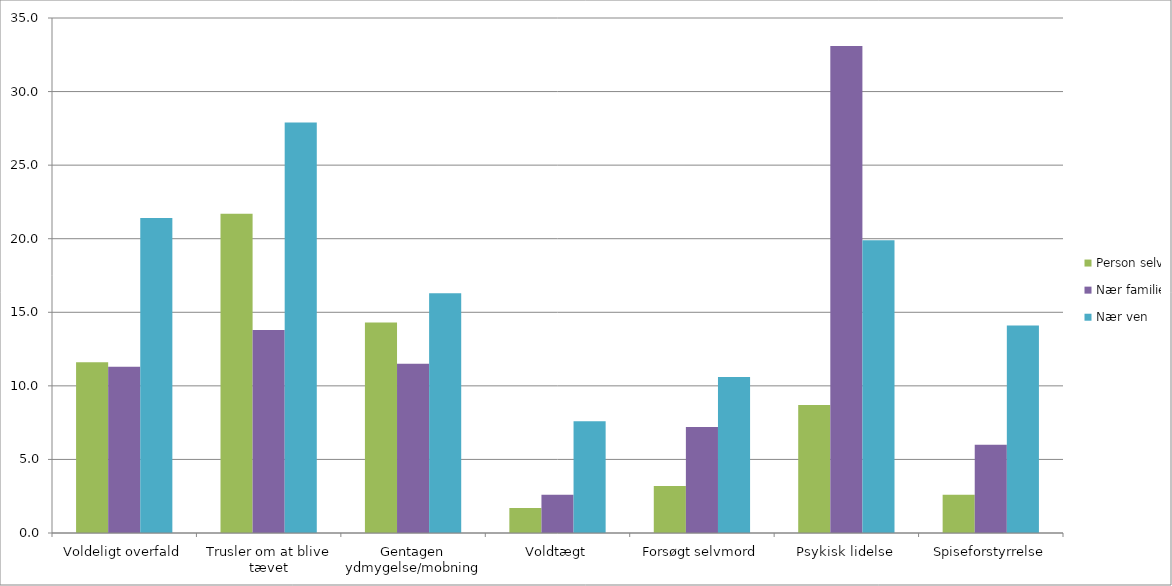
| Category | Person selv | Nær familie | Nær ven |
|---|---|---|---|
| Voldeligt overfald | 11.6 | 11.3 | 21.4 |
| Trusler om at blive tævet | 21.7 | 13.8 | 27.9 |
| Gentagen ydmygelse/mobning | 14.3 | 11.5 | 16.3 |
| Voldtægt | 1.7 | 2.6 | 7.6 |
| Forsøgt selvmord | 3.2 | 7.2 | 10.6 |
| Psykisk lidelse | 8.7 | 33.1 | 19.9 |
| Spiseforstyrrelse | 2.6 | 6 | 14.1 |